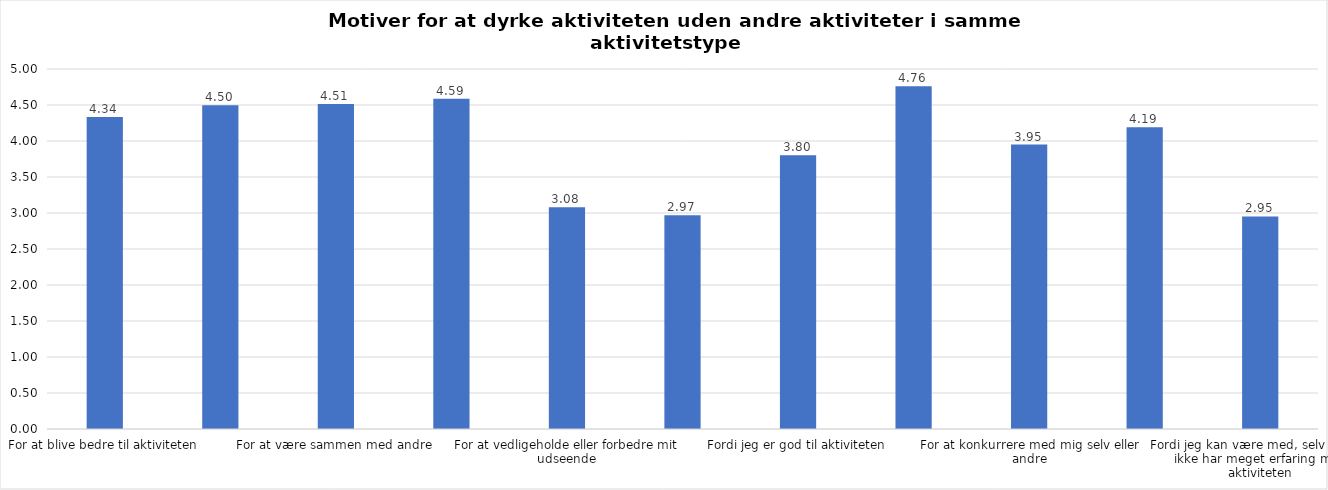
| Category | Gennemsnit |
|---|---|
| For at blive bedre til aktiviteten | 4.335 |
| For at vedligeholde eller forbedre min sundhed (fx helbred, fysisk form) | 4.498 |
| For at være sammen med andre | 4.513 |
| For at gøre noget godt for mig selv | 4.587 |
| For at vedligeholde eller forbedre mit udseende | 3.081 |
| Fordi andre i min omgangskreds opmuntrer mig til det | 2.97 |
| Fordi jeg er god til aktiviteten | 3.804 |
| Fordi jeg godt kan lide aktiviteten | 4.76 |
| For at konkurrere med mig selv eller andre | 3.951 |
| Fordi aktiviteten passer godt ind i min hverdag | 4.192 |
| Fordi jeg kan være med, selv om jeg ikke har meget erfaring med aktiviteten | 2.952 |